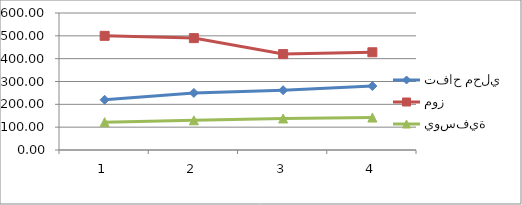
| Category | تفاح محلي | موز | يوسفية |
|---|---|---|---|
| 0 | 220 | 500 | 122 |
| 1 | 250 | 490 | 130 |
| 2 | 262 | 420 | 138 |
| 3 | 280 | 428 | 142 |